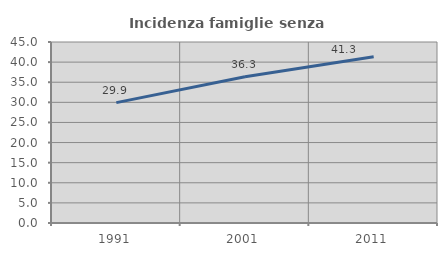
| Category | Incidenza famiglie senza nuclei |
|---|---|
| 1991.0 | 29.921 |
| 2001.0 | 36.341 |
| 2011.0 | 41.333 |